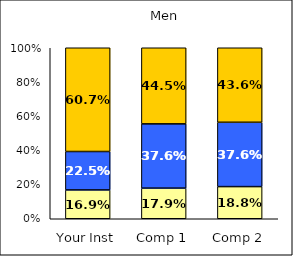
| Category | Low Social Self-Concept | Average Social Self-Concept | High Social Self-Concept |
|---|---|---|---|
| Your Inst | 0.169 | 0.225 | 0.607 |
| Comp 1 | 0.179 | 0.376 | 0.445 |
| Comp 2 | 0.188 | 0.376 | 0.436 |